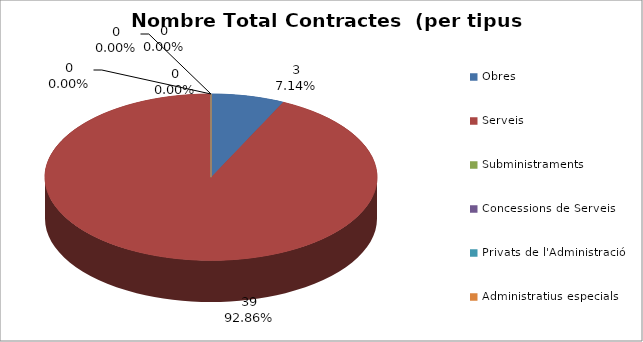
| Category | Nombre Total Contractes |
|---|---|
| Obres | 3 |
| Serveis | 39 |
| Subministraments | 0 |
| Concessions de Serveis | 0 |
| Privats de l'Administració | 0 |
| Administratius especials | 0 |